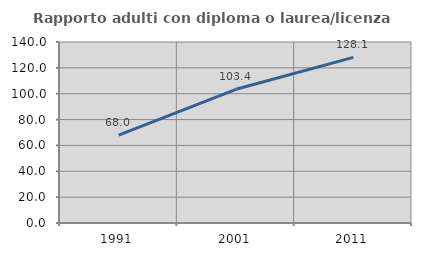
| Category | Rapporto adulti con diploma o laurea/licenza media  |
|---|---|
| 1991.0 | 68.015 |
| 2001.0 | 103.413 |
| 2011.0 | 128.07 |